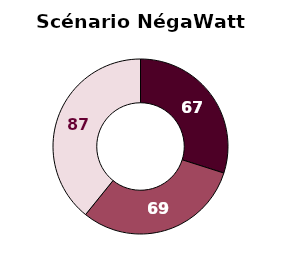
| Category | Scénario NegaWatt 2017 |
|---|---|
| Gaz naturel | 0 |
| Biométhane 1G - Méthanisation | 66.7 |
| Biométhane 2G - Gazéification | 68.9 |
| Biométhane 3G - Microalgue | 0 |
| Hydrogène/Méthanation | 87.4 |